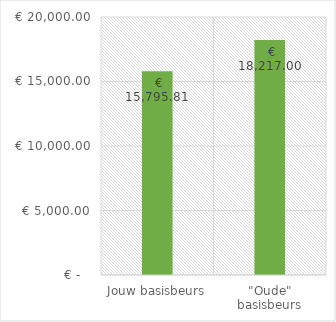
| Category | Series 0 |
|---|---|
| Jouw basisbeurs | 15795.81 |
| "Oude" basisbeurs | 18217 |